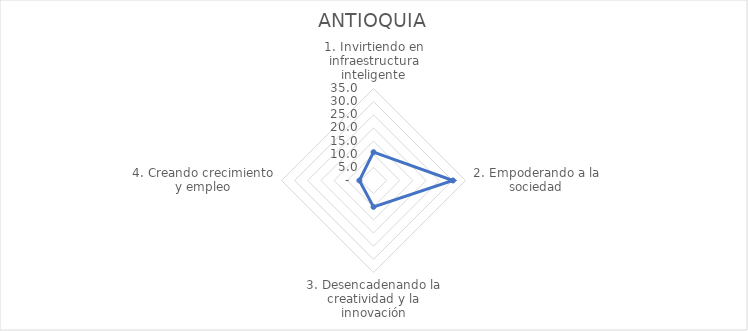
| Category | ANTIOQUIA |
|---|---|
| 1. Invirtiendo en infraestructura inteligente | 10.776 |
| 2. Empoderando a la sociedad | 30.232 |
| 3. Desencadenando la creatividad y la innovación | 10.046 |
| 4. Creando crecimiento y empleo | 5.377 |